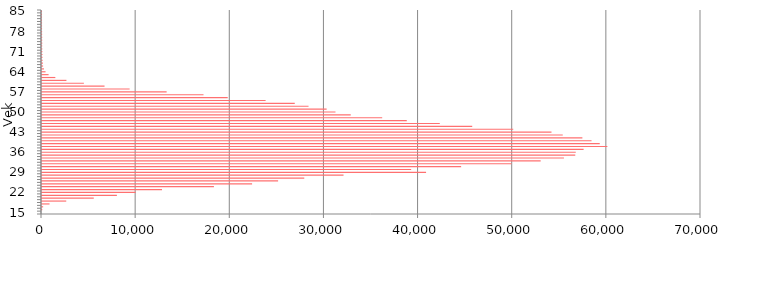
| Category | Series 0 |
|---|---|
| 15.0 | 0 |
| 16.0 | 28 |
| 17.0 | 121 |
| 18.0 | 799 |
| 19.0 | 2575 |
| 20.0 | 5498 |
| 21.0 | 7956 |
| 22.0 | 9955 |
| 23.0 | 12746 |
| 24.0 | 18261 |
| 25.0 | 22315 |
| 26.0 | 25079 |
| 27.0 | 27859 |
| 28.0 | 32028 |
| 29.0 | 40796 |
| 30.0 | 39212 |
| 31.0 | 44521 |
| 32.0 | 49872 |
| 33.0 | 52969 |
| 34.0 | 55441 |
| 35.0 | 56644 |
| 36.0 | 56697 |
| 37.0 | 57530 |
| 38.0 | 60056 |
| 39.0 | 59244 |
| 40.0 | 58371 |
| 41.0 | 57400 |
| 42.0 | 55315 |
| 43.0 | 54118 |
| 44.0 | 50057 |
| 45.0 | 45699 |
| 46.0 | 42253 |
| 47.0 | 38746 |
| 48.0 | 36136 |
| 49.0 | 32796 |
| 50.0 | 31174 |
| 51.0 | 30233 |
| 52.0 | 28311 |
| 53.0 | 26849 |
| 54.0 | 23752 |
| 55.0 | 19727 |
| 56.0 | 17156 |
| 57.0 | 13238 |
| 58.0 | 9307 |
| 59.0 | 6642 |
| 60.0 | 4448 |
| 61.0 | 2595 |
| 62.0 | 1418 |
| 63.0 | 699 |
| 64.0 | 376 |
| 65.0 | 210 |
| 66.0 | 116 |
| 67.0 | 97 |
| 68.0 | 78 |
| 69.0 | 49 |
| 70.0 | 55 |
| 71.0 | 39 |
| 72.0 | 31 |
| 73.0 | 23 |
| 74.0 | 29 |
| 75.0 | 24 |
| 76.0 | 22 |
| 77.0 | 15 |
| 78.0 | 11 |
| 79.0 | 5 |
| 80.0 | 5 |
| 81.0 | 5 |
| 82.0 | 4 |
| 83.0 | 3 |
| 84.0 | 2 |
| 85.0 | 1 |